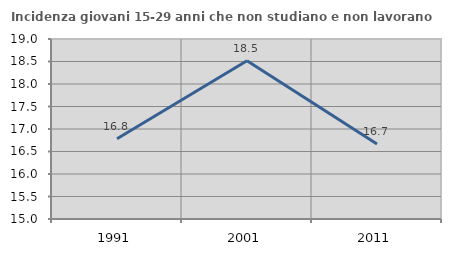
| Category | Incidenza giovani 15-29 anni che non studiano e non lavorano  |
|---|---|
| 1991.0 | 16.782 |
| 2001.0 | 18.519 |
| 2011.0 | 16.667 |